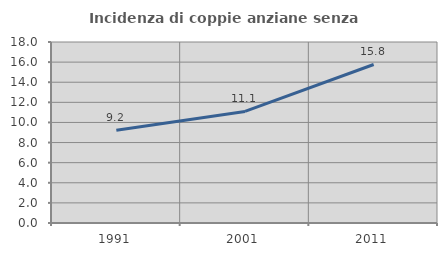
| Category | Incidenza di coppie anziane senza figli  |
|---|---|
| 1991.0 | 9.221 |
| 2001.0 | 11.095 |
| 2011.0 | 15.763 |